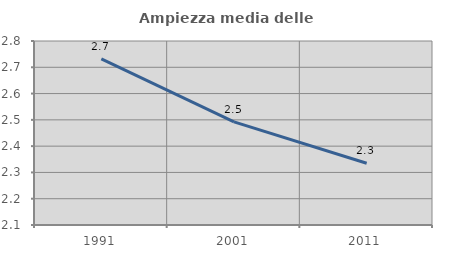
| Category | Ampiezza media delle famiglie |
|---|---|
| 1991.0 | 2.732 |
| 2001.0 | 2.492 |
| 2011.0 | 2.335 |